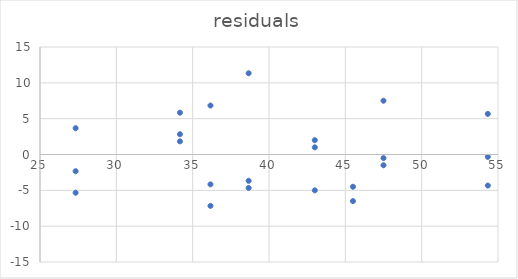
| Category | residuals |
|---|---|
| 27.333333333333336 | -5.333 |
| 36.16666666666667 | -4.167 |
| 38.66666666666667 | -3.667 |
| 47.5 | 7.5 |
| 43.0 | 1 |
| 34.16666666666667 | 5.833 |
| 54.33333333333333 | 5.667 |
| 45.5 | -6.5 |
| 27.333333333333336 | 3.667 |
| 36.16666666666667 | 6.833 |
| 38.66666666666667 | -4.667 |
| 47.5 | -0.5 |
| 43.0 | 2 |
| 34.16666666666667 | 2.833 |
| 54.33333333333333 | -4.333 |
| 45.5 | -4.5 |
| 27.333333333333336 | -2.333 |
| 36.16666666666667 | -7.167 |
| 38.66666666666667 | 11.333 |
| 47.5 | -1.5 |
| 43.0 | -5 |
| 34.16666666666667 | 1.833 |
| 54.33333333333333 | -0.333 |